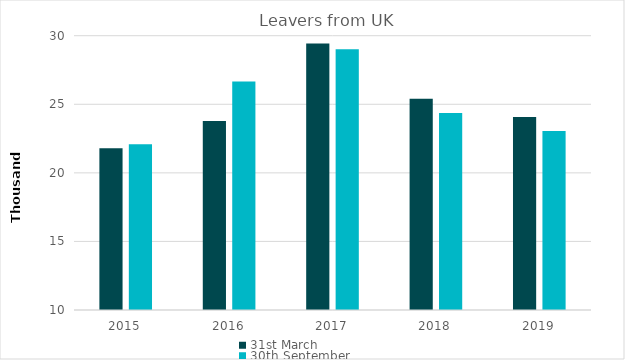
| Category | 31st March | 30th September |
|---|---|---|
| 2015.0 | 21790 | 22094 |
| 2016.0 | 23788 | 26653 |
| 2017.0 | 29434 | 29019 |
| 2018.0 | 25400 | 24369 |
| 2019.0 | 24069 | 23045 |